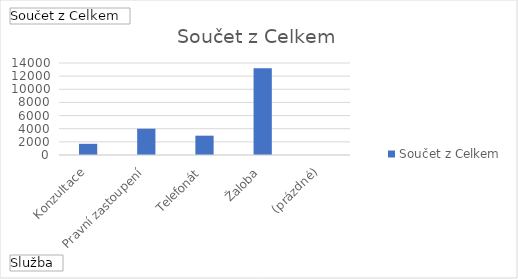
| Category | Celkem |
|---|---|
| Konzultace | 1700 |
| Pravní zastoupení | 4000 |
| Telefonát | 2940 |
| Žaloba | 13200 |
| (prázdné) | 0 |